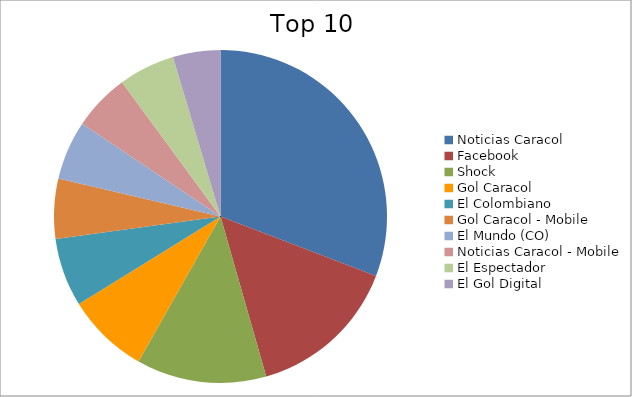
| Category | Series 0 |
|---|---|
| Noticias Caracol | 11.84 |
| Facebook | 5.67 |
| Shock | 4.85 |
| Gol Caracol | 3.07 |
| El Colombiano | 2.56 |
| Gol Caracol - Mobile | 2.23 |
| El Mundo (CO) | 2.21 |
| Noticias Caracol - Mobile | 2.12 |
| El Espectador | 2.1 |
| El Gol Digital | 1.77 |